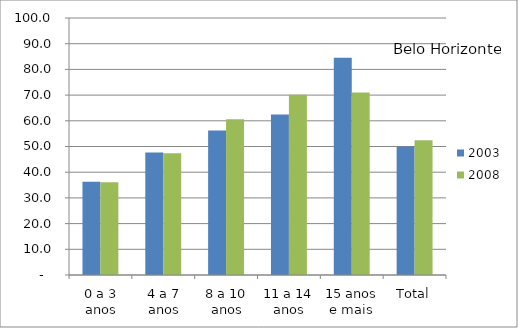
| Category | 2003 | 2008 |
|---|---|---|
| 0 a 3 anos | 36.31 | 36.13 |
| 4 a 7 anos | 47.62 | 47.38 |
| 8 a 10 anos | 56.25 | 60.65 |
| 11 a 14 anos | 62.43 | 70.14 |
| 15 anos e mais | 84.5 | 71.05 |
| Total | 50 | 52.41 |